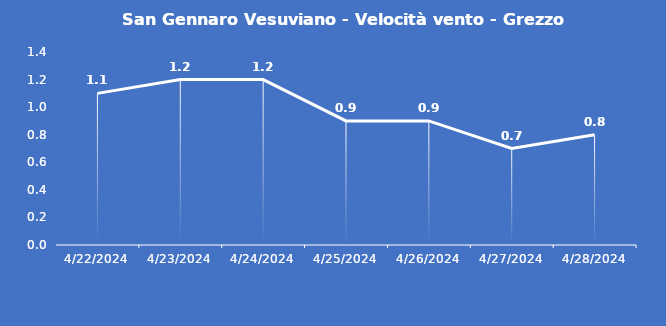
| Category | San Gennaro Vesuviano - Velocità vento - Grezzo (m/s) |
|---|---|
| 4/22/24 | 1.1 |
| 4/23/24 | 1.2 |
| 4/24/24 | 1.2 |
| 4/25/24 | 0.9 |
| 4/26/24 | 0.9 |
| 4/27/24 | 0.7 |
| 4/28/24 | 0.8 |